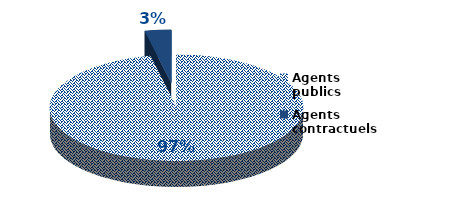
| Category | Series 0 |
|---|---|
| Agents publics | 144 |
| Agents contractuels | 5 |